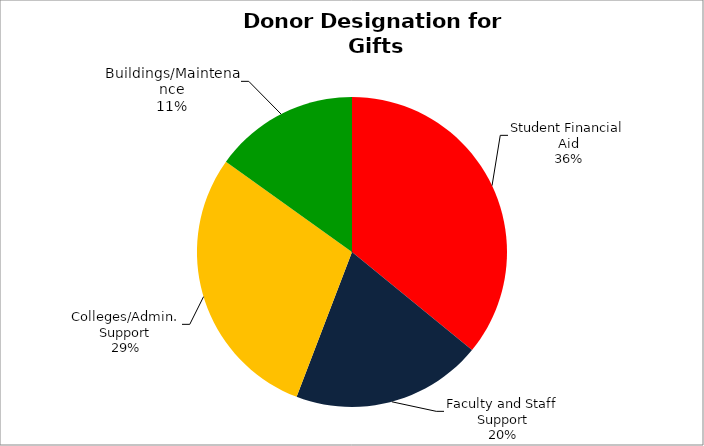
| Category | Series 0 |
|---|---|
| Student Financial Aid | 0.359 |
| Faculty and Staff Support | 0.199 |
| Colleges/Admin. Support | 0.291 |
| Buildings/Maintenance | 0.151 |